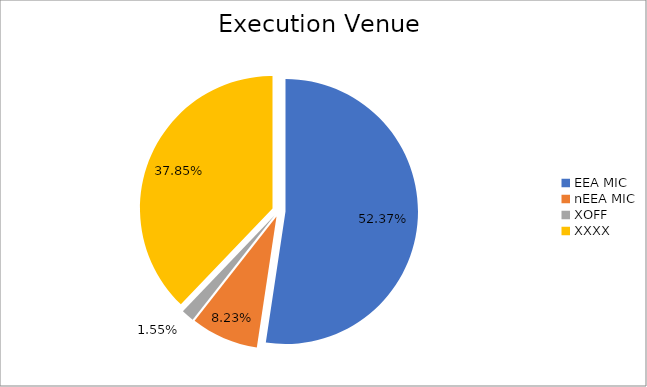
| Category | Series 0 |
|---|---|
| EEA MIC | 6512287.489 |
| nEEA MIC | 1023086.581 |
| XOFF | 192994.139 |
| XXXX | 4706258.294 |